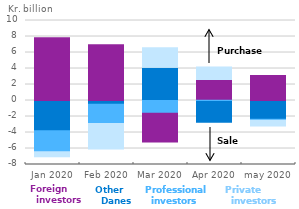
| Category | Other danes | Professional investors | Foreign investors | Private investors |
|---|---|---|---|---|
| jan 2020 | -3.772 | -2.627 | 7.836 | -0.773 |
| feb 2020 | -0.461 | -2.424 | 6.959 | -3.304 |
| mar 2020 | 4.044 | -1.589 | -3.587 | 2.557 |
| apr 2020 | -2.712 | 0.15 | 2.335 | 1.691 |
| may 2020 | -2.342 | -0.131 | 3.135 | -0.826 |